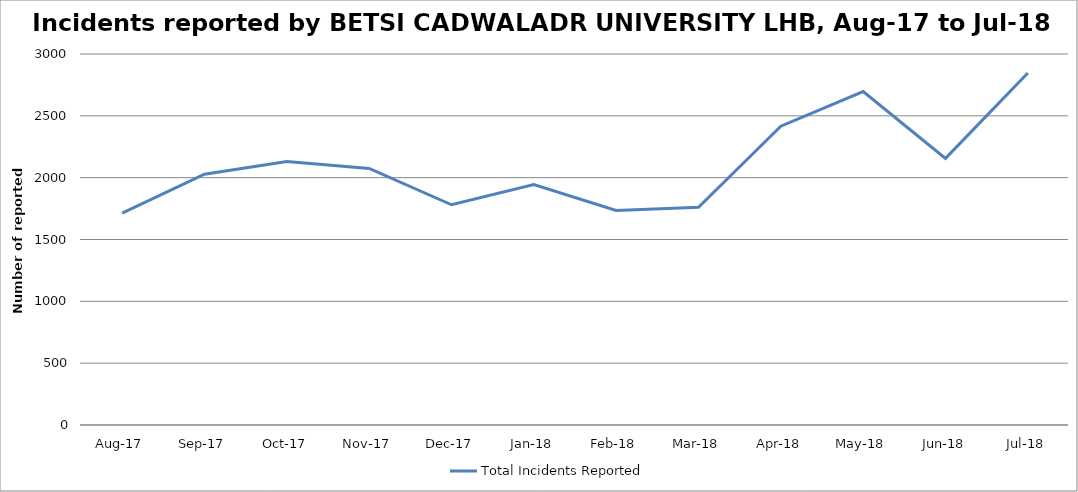
| Category | Total Incidents Reported |
|---|---|
| Aug-17 | 1714 |
| Sep-17 | 2028 |
| Oct-17 | 2130 |
| Nov-17 | 2075 |
| Dec-17 | 1781 |
| Jan-18 | 1944 |
| Feb-18 | 1735 |
| Mar-18 | 1761 |
| Apr-18 | 2416 |
| May-18 | 2696 |
| Jun-18 | 2156 |
| Jul-18 | 2847 |